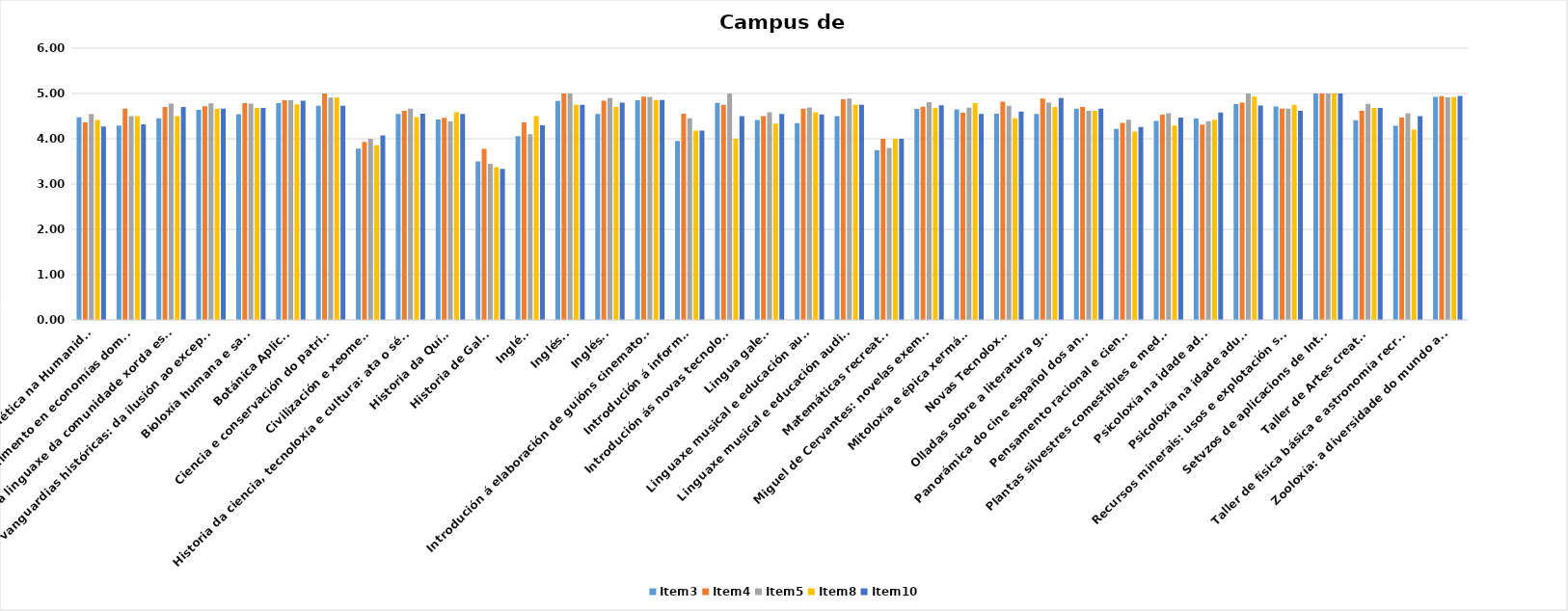
| Category | Satisfacción xeral |
|---|---|
| Ourense | 4.774 |
| Pontevedra | 4.73 |
| Vigo | 4.733 |
| Media xeral | 4.741 |